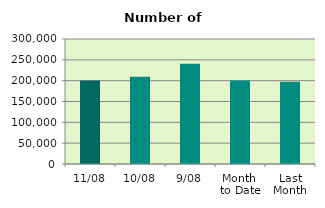
| Category | Series 0 |
|---|---|
| 11/08 | 200454 |
| 10/08 | 209264 |
| 9/08 | 240834 |
| Month 
to Date | 200565.111 |
| Last
Month | 197154 |